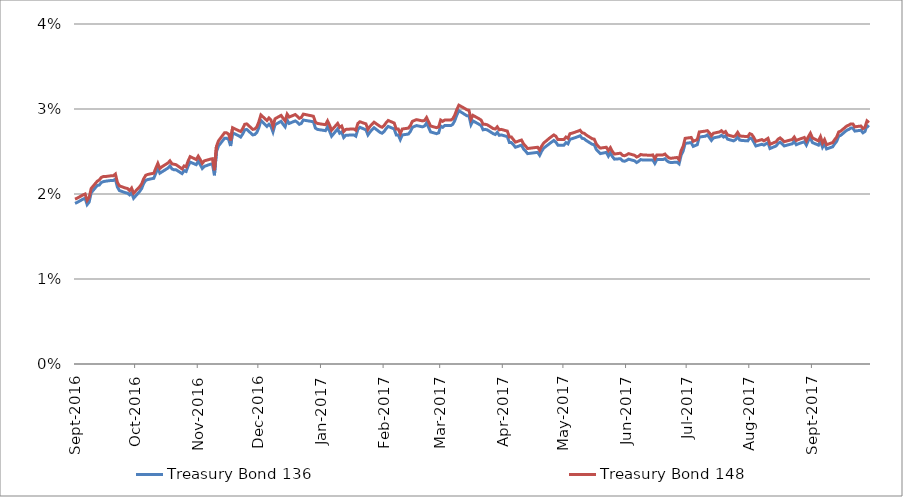
| Category | Treasury Bond 136 | Treasury Bond 148 |
|---|---|---|
| 2016-09-01 | 0.019 | 0.019 |
| 2016-09-02 | 0.019 | 0.02 |
| 2016-09-05 | 0.019 | 0.02 |
| 2016-09-06 | 0.02 | 0.02 |
| 2016-09-07 | 0.019 | 0.019 |
| 2016-09-08 | 0.019 | 0.02 |
| 2016-09-09 | 0.02 | 0.021 |
| 2016-09-12 | 0.021 | 0.022 |
| 2016-09-13 | 0.021 | 0.022 |
| 2016-09-14 | 0.021 | 0.022 |
| 2016-09-15 | 0.021 | 0.022 |
| 2016-09-16 | 0.022 | 0.022 |
| 2016-09-19 | 0.022 | 0.022 |
| 2016-09-20 | 0.022 | 0.022 |
| 2016-09-21 | 0.022 | 0.022 |
| 2016-09-22 | 0.021 | 0.021 |
| 2016-09-23 | 0.02 | 0.021 |
| 2016-09-26 | 0.02 | 0.021 |
| 2016-09-27 | 0.02 | 0.021 |
| 2016-09-28 | 0.02 | 0.02 |
| 2016-09-29 | 0.02 | 0.021 |
| 2016-09-30 | 0.02 | 0.02 |
| 2016-10-03 | 0.02 | 0.021 |
| 2016-10-04 | 0.021 | 0.021 |
| 2016-10-05 | 0.021 | 0.022 |
| 2016-10-06 | 0.022 | 0.022 |
| 2016-10-07 | 0.022 | 0.022 |
| 2016-10-10 | 0.022 | 0.022 |
| 2016-10-11 | 0.022 | 0.023 |
| 2016-10-12 | 0.023 | 0.024 |
| 2016-10-13 | 0.022 | 0.023 |
| 2016-10-14 | 0.023 | 0.023 |
| 2016-10-17 | 0.023 | 0.024 |
| 2016-10-18 | 0.023 | 0.024 |
| 2016-10-19 | 0.023 | 0.024 |
| 2016-10-20 | 0.023 | 0.024 |
| 2016-10-21 | 0.023 | 0.023 |
| 2016-10-24 | 0.022 | 0.023 |
| 2016-10-25 | 0.023 | 0.023 |
| 2016-10-26 | 0.023 | 0.023 |
| 2016-10-27 | 0.023 | 0.024 |
| 2016-10-28 | 0.024 | 0.024 |
| 2016-10-31 | 0.023 | 0.024 |
| 2016-11-01 | 0.024 | 0.024 |
| 2016-11-02 | 0.023 | 0.024 |
| 2016-11-03 | 0.023 | 0.024 |
| 2016-11-04 | 0.023 | 0.024 |
| 2016-11-07 | 0.024 | 0.024 |
| 2016-11-08 | 0.024 | 0.024 |
| 2016-11-09 | 0.022 | 0.023 |
| 2016-11-10 | 0.025 | 0.026 |
| 2016-11-11 | 0.026 | 0.026 |
| 2016-11-14 | 0.027 | 0.027 |
| 2016-11-15 | 0.027 | 0.027 |
| 2016-11-16 | 0.026 | 0.027 |
| 2016-11-17 | 0.026 | 0.026 |
| 2016-11-18 | 0.027 | 0.028 |
| 2016-11-21 | 0.027 | 0.027 |
| 2016-11-22 | 0.027 | 0.027 |
| 2016-11-23 | 0.027 | 0.028 |
| 2016-11-24 | 0.028 | 0.028 |
| 2016-11-25 | 0.028 | 0.028 |
| 2016-11-28 | 0.027 | 0.028 |
| 2016-11-29 | 0.027 | 0.028 |
| 2016-11-30 | 0.027 | 0.028 |
| 2016-12-01 | 0.028 | 0.028 |
| 2016-12-02 | 0.029 | 0.029 |
| 2016-12-05 | 0.028 | 0.029 |
| 2016-12-06 | 0.028 | 0.029 |
| 2016-12-07 | 0.028 | 0.029 |
| 2016-12-08 | 0.027 | 0.028 |
| 2016-12-09 | 0.028 | 0.029 |
| 2016-12-12 | 0.029 | 0.029 |
| 2016-12-13 | 0.028 | 0.029 |
| 2016-12-14 | 0.028 | 0.029 |
| 2016-12-15 | 0.029 | 0.029 |
| 2016-12-16 | 0.028 | 0.029 |
| 2016-12-19 | 0.029 | 0.029 |
| 2016-12-20 | 0.028 | 0.029 |
| 2016-12-21 | 0.028 | 0.029 |
| 2016-12-22 | 0.028 | 0.029 |
| 2016-12-23 | 0.029 | 0.029 |
| 2016-12-28 | 0.028 | 0.029 |
| 2016-12-29 | 0.028 | 0.028 |
| 2016-12-30 | 0.028 | 0.028 |
| 2017-01-03 | 0.027 | 0.028 |
| 2017-01-04 | 0.028 | 0.029 |
| 2017-01-05 | 0.027 | 0.028 |
| 2017-01-06 | 0.027 | 0.028 |
| 2017-01-09 | 0.028 | 0.028 |
| 2017-01-10 | 0.027 | 0.028 |
| 2017-01-11 | 0.027 | 0.028 |
| 2017-01-12 | 0.027 | 0.027 |
| 2017-01-13 | 0.027 | 0.028 |
| 2017-01-16 | 0.027 | 0.028 |
| 2017-01-17 | 0.027 | 0.028 |
| 2017-01-18 | 0.027 | 0.028 |
| 2017-01-19 | 0.028 | 0.028 |
| 2017-01-20 | 0.028 | 0.028 |
| 2017-01-23 | 0.028 | 0.028 |
| 2017-01-24 | 0.027 | 0.028 |
| 2017-01-25 | 0.027 | 0.028 |
| 2017-01-27 | 0.028 | 0.028 |
| 2017-01-30 | 0.027 | 0.028 |
| 2017-01-31 | 0.027 | 0.028 |
| 2017-02-01 | 0.027 | 0.028 |
| 2017-02-02 | 0.028 | 0.028 |
| 2017-02-03 | 0.028 | 0.029 |
| 2017-02-06 | 0.028 | 0.028 |
| 2017-02-07 | 0.027 | 0.028 |
| 2017-02-08 | 0.027 | 0.028 |
| 2017-02-09 | 0.026 | 0.027 |
| 2017-02-10 | 0.027 | 0.028 |
| 2017-02-13 | 0.027 | 0.028 |
| 2017-02-14 | 0.027 | 0.028 |
| 2017-02-15 | 0.028 | 0.029 |
| 2017-02-16 | 0.028 | 0.029 |
| 2017-02-17 | 0.028 | 0.029 |
| 2017-02-20 | 0.028 | 0.029 |
| 2017-02-21 | 0.028 | 0.029 |
| 2017-02-22 | 0.028 | 0.029 |
| 2017-02-23 | 0.028 | 0.028 |
| 2017-02-24 | 0.027 | 0.028 |
| 2017-02-27 | 0.027 | 0.028 |
| 2017-02-28 | 0.027 | 0.028 |
| 2017-03-01 | 0.028 | 0.029 |
| 2017-03-02 | 0.028 | 0.029 |
| 2017-03-03 | 0.028 | 0.029 |
| 2017-03-06 | 0.028 | 0.029 |
| 2017-03-07 | 0.028 | 0.029 |
| 2017-03-08 | 0.029 | 0.029 |
| 2017-03-09 | 0.029 | 0.03 |
| 2017-03-10 | 0.03 | 0.03 |
| 2017-03-13 | 0.029 | 0.03 |
| 2017-03-14 | 0.029 | 0.03 |
| 2017-03-15 | 0.029 | 0.03 |
| 2017-03-16 | 0.028 | 0.029 |
| 2017-03-17 | 0.029 | 0.029 |
| 2017-03-20 | 0.028 | 0.029 |
| 2017-03-21 | 0.028 | 0.029 |
| 2017-03-22 | 0.028 | 0.028 |
| 2017-03-23 | 0.028 | 0.028 |
| 2017-03-24 | 0.028 | 0.028 |
| 2017-03-27 | 0.027 | 0.028 |
| 2017-03-28 | 0.027 | 0.028 |
| 2017-03-29 | 0.027 | 0.028 |
| 2017-03-30 | 0.027 | 0.028 |
| 2017-03-31 | 0.027 | 0.028 |
| 2017-04-03 | 0.027 | 0.027 |
| 2017-04-04 | 0.026 | 0.027 |
| 2017-04-05 | 0.026 | 0.027 |
| 2017-04-06 | 0.026 | 0.026 |
| 2017-04-07 | 0.026 | 0.026 |
| 2017-04-10 | 0.026 | 0.026 |
| 2017-04-11 | 0.025 | 0.026 |
| 2017-04-12 | 0.025 | 0.026 |
| 2017-04-13 | 0.025 | 0.025 |
| 2017-04-18 | 0.025 | 0.026 |
| 2017-04-19 | 0.025 | 0.025 |
| 2017-04-20 | 0.025 | 0.026 |
| 2017-04-21 | 0.025 | 0.026 |
| 2017-04-24 | 0.026 | 0.027 |
| 2017-04-26 | 0.026 | 0.027 |
| 2017-04-27 | 0.026 | 0.027 |
| 2017-04-28 | 0.026 | 0.026 |
| 2017-05-01 | 0.026 | 0.026 |
| 2017-05-02 | 0.026 | 0.027 |
| 2017-05-03 | 0.026 | 0.027 |
| 2017-05-04 | 0.026 | 0.027 |
| 2017-05-05 | 0.026 | 0.027 |
| 2017-05-08 | 0.027 | 0.027 |
| 2017-05-09 | 0.027 | 0.028 |
| 2017-05-10 | 0.027 | 0.027 |
| 2017-05-11 | 0.026 | 0.027 |
| 2017-05-12 | 0.026 | 0.027 |
| 2017-05-15 | 0.026 | 0.026 |
| 2017-05-16 | 0.026 | 0.026 |
| 2017-05-17 | 0.025 | 0.026 |
| 2017-05-18 | 0.025 | 0.026 |
| 2017-05-19 | 0.025 | 0.025 |
| 2017-05-22 | 0.025 | 0.026 |
| 2017-05-23 | 0.024 | 0.025 |
| 2017-05-24 | 0.025 | 0.025 |
| 2017-05-25 | 0.024 | 0.025 |
| 2017-05-26 | 0.024 | 0.025 |
| 2017-05-29 | 0.024 | 0.025 |
| 2017-05-30 | 0.024 | 0.025 |
| 2017-05-31 | 0.024 | 0.024 |
| 2017-06-01 | 0.024 | 0.025 |
| 2017-06-02 | 0.024 | 0.025 |
| 2017-06-05 | 0.024 | 0.025 |
| 2017-06-06 | 0.024 | 0.024 |
| 2017-06-07 | 0.024 | 0.024 |
| 2017-06-08 | 0.024 | 0.025 |
| 2017-06-09 | 0.024 | 0.025 |
| 2017-06-13 | 0.024 | 0.025 |
| 2017-06-14 | 0.024 | 0.025 |
| 2017-06-15 | 0.024 | 0.024 |
| 2017-06-16 | 0.024 | 0.025 |
| 2017-06-19 | 0.024 | 0.025 |
| 2017-06-20 | 0.024 | 0.025 |
| 2017-06-21 | 0.024 | 0.024 |
| 2017-06-22 | 0.024 | 0.024 |
| 2017-06-23 | 0.024 | 0.024 |
| 2017-06-26 | 0.024 | 0.024 |
| 2017-06-27 | 0.024 | 0.024 |
| 2017-06-28 | 0.025 | 0.025 |
| 2017-06-29 | 0.025 | 0.026 |
| 2017-06-30 | 0.026 | 0.027 |
| 2017-07-03 | 0.026 | 0.027 |
| 2017-07-04 | 0.026 | 0.026 |
| 2017-07-05 | 0.026 | 0.026 |
| 2017-07-06 | 0.026 | 0.026 |
| 2017-07-07 | 0.027 | 0.027 |
| 2017-07-10 | 0.027 | 0.027 |
| 2017-07-11 | 0.027 | 0.027 |
| 2017-07-12 | 0.027 | 0.027 |
| 2017-07-13 | 0.026 | 0.027 |
| 2017-07-14 | 0.027 | 0.027 |
| 2017-07-17 | 0.027 | 0.027 |
| 2017-07-18 | 0.027 | 0.027 |
| 2017-07-19 | 0.027 | 0.027 |
| 2017-07-20 | 0.027 | 0.027 |
| 2017-07-21 | 0.026 | 0.027 |
| 2017-07-24 | 0.026 | 0.027 |
| 2017-07-25 | 0.026 | 0.027 |
| 2017-07-26 | 0.027 | 0.027 |
| 2017-07-27 | 0.026 | 0.027 |
| 2017-07-28 | 0.026 | 0.027 |
| 2017-07-31 | 0.026 | 0.027 |
| 2017-08-01 | 0.027 | 0.027 |
| 2017-08-02 | 0.026 | 0.027 |
| 2017-08-03 | 0.026 | 0.027 |
| 2017-08-04 | 0.026 | 0.026 |
| 2017-08-07 | 0.026 | 0.026 |
| 2017-08-08 | 0.026 | 0.026 |
| 2017-08-09 | 0.026 | 0.026 |
| 2017-08-10 | 0.026 | 0.027 |
| 2017-08-11 | 0.025 | 0.026 |
| 2017-08-14 | 0.026 | 0.026 |
| 2017-08-15 | 0.026 | 0.026 |
| 2017-08-16 | 0.026 | 0.027 |
| 2017-08-17 | 0.026 | 0.026 |
| 2017-08-18 | 0.026 | 0.026 |
| 2017-08-21 | 0.026 | 0.026 |
| 2017-08-22 | 0.026 | 0.026 |
| 2017-08-23 | 0.026 | 0.027 |
| 2017-08-24 | 0.026 | 0.026 |
| 2017-08-25 | 0.026 | 0.026 |
| 2017-08-28 | 0.026 | 0.027 |
| 2017-08-29 | 0.026 | 0.026 |
| 2017-08-30 | 0.026 | 0.027 |
| 2017-08-31 | 0.027 | 0.027 |
| 2017-09-01 | 0.026 | 0.027 |
| 2017-09-04 | 0.026 | 0.026 |
| 2017-09-05 | 0.026 | 0.027 |
| 2017-09-06 | 0.026 | 0.026 |
| 2017-09-07 | 0.026 | 0.026 |
| 2017-09-08 | 0.025 | 0.026 |
| 2017-09-11 | 0.026 | 0.026 |
| 2017-09-12 | 0.026 | 0.026 |
| 2017-09-13 | 0.026 | 0.027 |
| 2017-09-14 | 0.027 | 0.027 |
| 2017-09-15 | 0.027 | 0.027 |
| 2017-09-18 | 0.028 | 0.028 |
| 2017-09-19 | 0.028 | 0.028 |
| 2017-09-20 | 0.028 | 0.028 |
| 2017-09-21 | 0.028 | 0.028 |
| 2017-09-22 | 0.027 | 0.028 |
| 2017-09-25 | 0.028 | 0.028 |
| 2017-09-26 | 0.027 | 0.028 |
| 2017-09-27 | 0.027 | 0.028 |
| 2017-09-28 | 0.028 | 0.029 |
| 2017-09-29 | 0.028 | 0.028 |